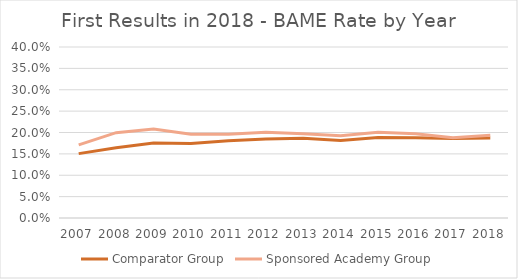
| Category | Comparator Group | Sponsored Academy Group |
|---|---|---|
| 2007.0 | 0.151 | 0.171 |
| 2008.0 | 0.164 | 0.2 |
| 2009.0 | 0.175 | 0.208 |
| 2010.0 | 0.174 | 0.196 |
| 2011.0 | 0.181 | 0.196 |
| 2012.0 | 0.185 | 0.201 |
| 2013.0 | 0.186 | 0.197 |
| 2014.0 | 0.182 | 0.192 |
| 2015.0 | 0.189 | 0.2 |
| 2016.0 | 0.188 | 0.197 |
| 2017.0 | 0.186 | 0.188 |
| 2018.0 | 0.187 | 0.194 |